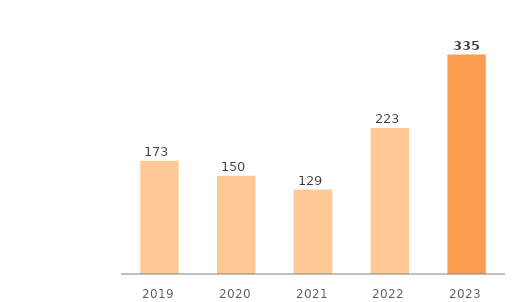
| Category | Assets in Kazakhstan |
|---|---|
| 2019.0 | 173 |
| 2020.0 | 150 |
| 2021.0 | 129 |
| 2022.0 | 223 |
| 2023.0 | 335 |